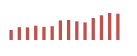
| Category | Importações (2) |
|---|---|
| 0 | 63256.661 |
| 1 | 80362.628 |
| 2 | 79098.748 |
| 3 | 89493.365 |
| 4 | 81914.569 |
| 5 | 86371.3 |
| 6 | 122399.001 |
| 7 | 125153.991 |
| 8 | 116754.909 |
| 9 | 110190.536 |
| 10 | 137205.926 |
| 11 | 154727.051 |
| 12 | 169208.338 |
| 13 | 164005.199 |